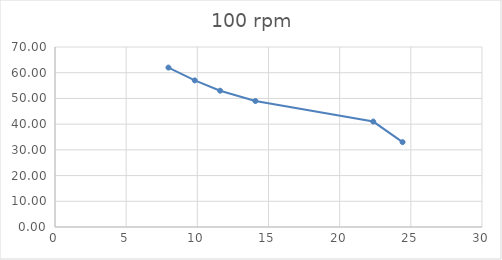
| Category | Series 0 |
|---|---|
| 7.969999999999999 | 62 |
| 9.82 | 57 |
| 11.6 | 53 |
| 14.079999999999998 | 49 |
| 22.36 | 41 |
| 24.42 | 33 |